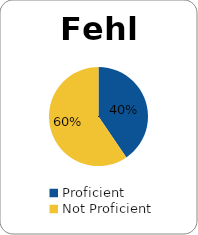
| Category | Series 0 |
|---|---|
| Proficient | 0.405 |
| Not Proficient | 0.595 |